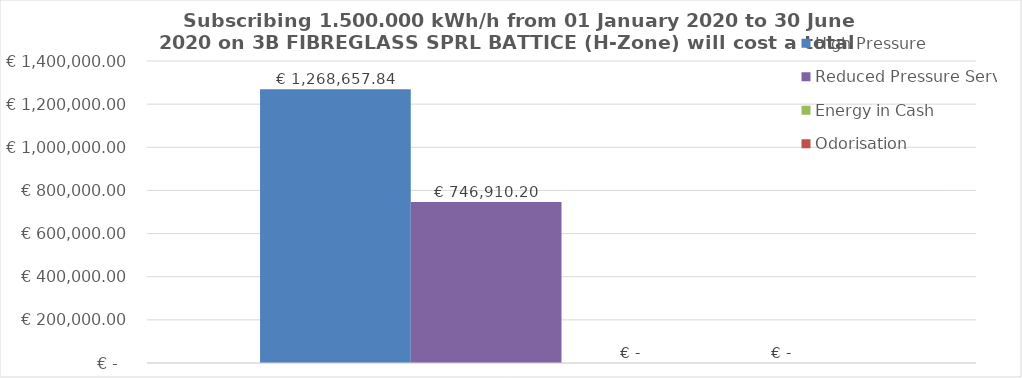
| Category | High Pressure | Reduced Pressure Service | Energy in Cash  | Odorisation |
|---|---|---|---|---|
|  | 1268657.836 | 746910.195 | 0 | 0 |